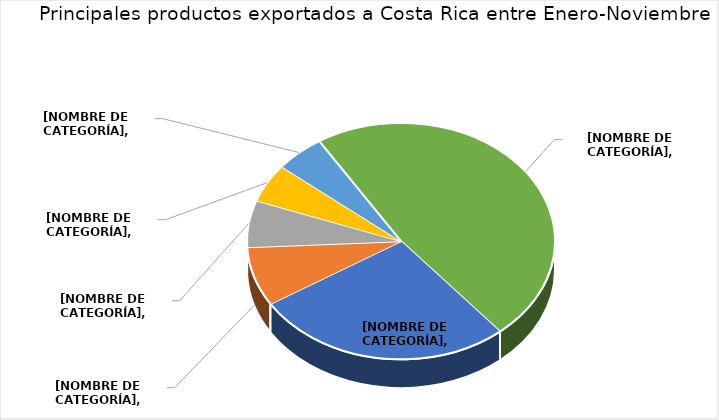
| Category | Series 0 |
|---|---|
| Envases de alimunio para cervezas o bebidas gasificadas. | 0.272 |
| Queso fundido, excepto el rayado o en polvo. | 0.081 |
| Las demás construcciones y sus partes de fundición, hierro o acero | 0.064 |
| Leche y nata (crema) evaporadas, sin adición de azúcar ni otro edulcorante | 0.053 |
| Huevos frescos, fecundados para incubación. | 0.052 |
| Resto de productos | 0.478 |